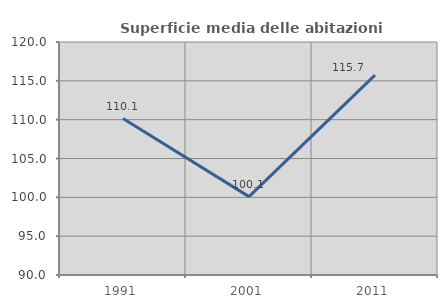
| Category | Superficie media delle abitazioni occupate |
|---|---|
| 1991.0 | 110.14 |
| 2001.0 | 100.093 |
| 2011.0 | 115.728 |